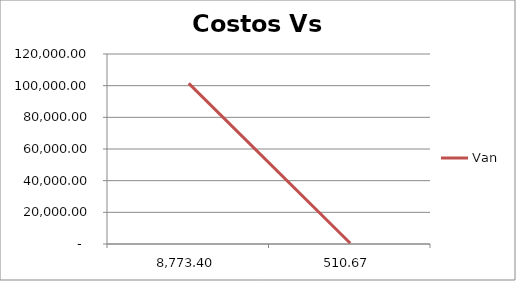
| Category | Van |
|---|---|
| 8773.404346133284 | 101479.539 |
| 510.6686837954767 | 510.669 |